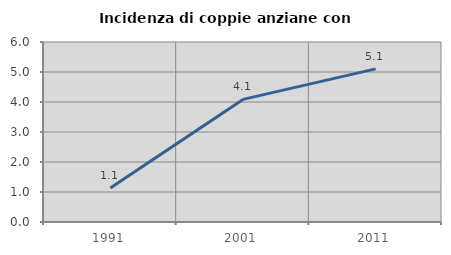
| Category | Incidenza di coppie anziane con figli |
|---|---|
| 1991.0 | 1.133 |
| 2001.0 | 4.087 |
| 2011.0 | 5.105 |